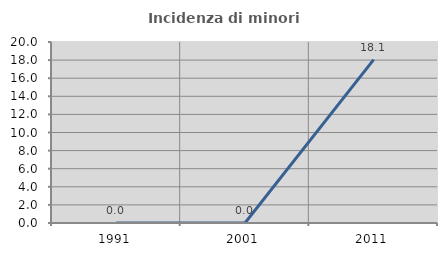
| Category | Incidenza di minori stranieri |
|---|---|
| 1991.0 | 0 |
| 2001.0 | 0 |
| 2011.0 | 18.056 |